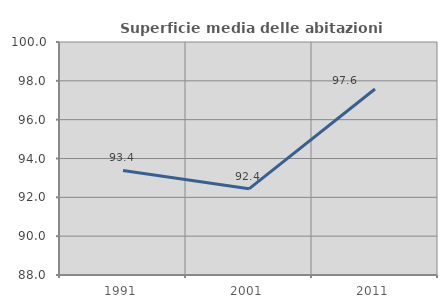
| Category | Superficie media delle abitazioni occupate |
|---|---|
| 1991.0 | 93.386 |
| 2001.0 | 92.438 |
| 2011.0 | 97.581 |